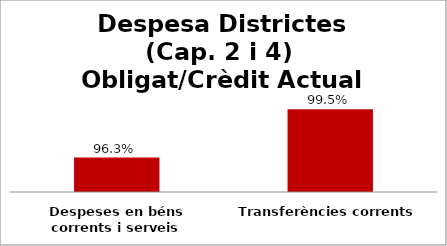
| Category | Series 0 |
|---|---|
| Despeses en béns corrents i serveis | 0.963 |
| Transferències corrents | 0.995 |